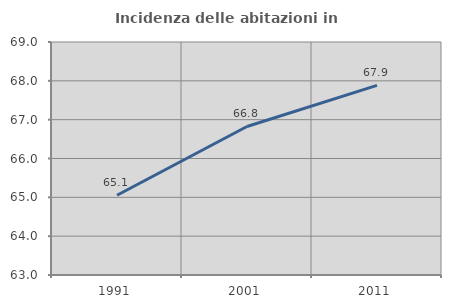
| Category | Incidenza delle abitazioni in proprietà  |
|---|---|
| 1991.0 | 65.054 |
| 2001.0 | 66.824 |
| 2011.0 | 67.882 |